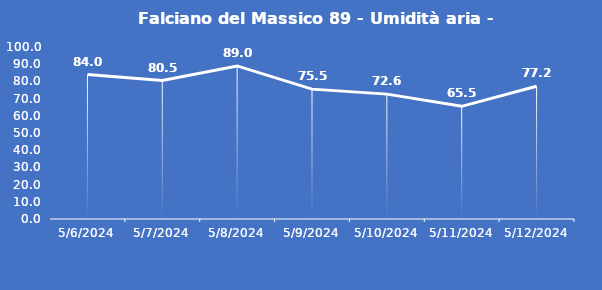
| Category | Falciano del Massico 89 - Umidità aria - Grezzo (%) |
|---|---|
| 5/6/24 | 84 |
| 5/7/24 | 80.5 |
| 5/8/24 | 89 |
| 5/9/24 | 75.5 |
| 5/10/24 | 72.6 |
| 5/11/24 | 65.5 |
| 5/12/24 | 77.2 |